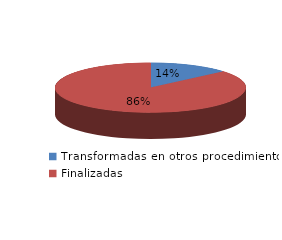
| Category | Series 0 |
|---|---|
| Transformadas en otros procedimientos | 3472 |
| Finalizadas | 22033 |